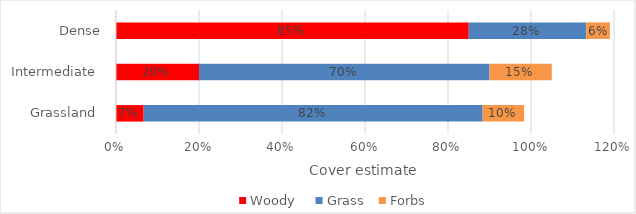
| Category | Woody  | Grass | Forbs |
|---|---|---|---|
| Grassland  | 0.067 | 0.817 | 0.1 |
| Intermediate  | 0.2 | 0.7 | 0.15 |
| Dense | 0.85 | 0.283 | 0.057 |